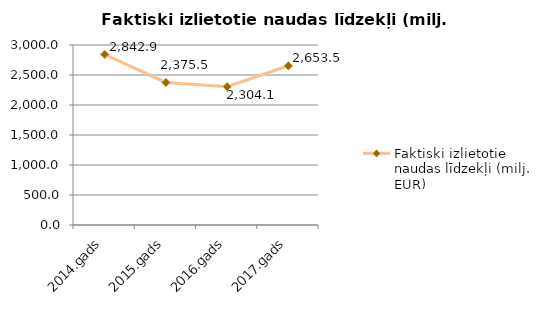
| Category | Faktiski izlietotie naudas līdzekļi (milj. EUR) |
|---|---|
| 2014.gads | 2842.887 |
| 2015.gads | 2375.471 |
| 2016.gads | 2304.104 |
| 2017.gads | 2653.503 |